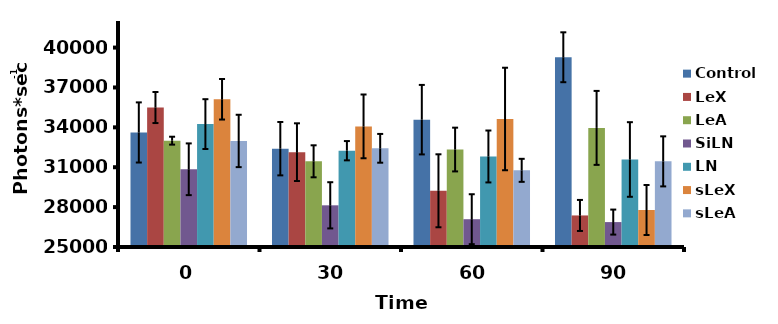
| Category | Control | LeX | LeA | SiLN | LN | sLeX | sLeA |
|---|---|---|---|---|---|---|---|
| 0.0 | 33615.8 | 35491.367 | 32998.233 | 30847.075 | 34244.533 | 36112.4 | 32977.467 |
| 30.0 | 32396.45 | 32133.1 | 31446.033 | 28135.8 | 32243.167 | 34073.05 | 32423.067 |
| 60.0 | 34578.25 | 29228.867 | 32331.3 | 27091 | 31809.333 | 34629.4 | 30767.2 |
| 90.0 | 39272.62 | 27373.267 | 33959.7 | 26874.033 | 31582.867 | 27784.2 | 31441.1 |